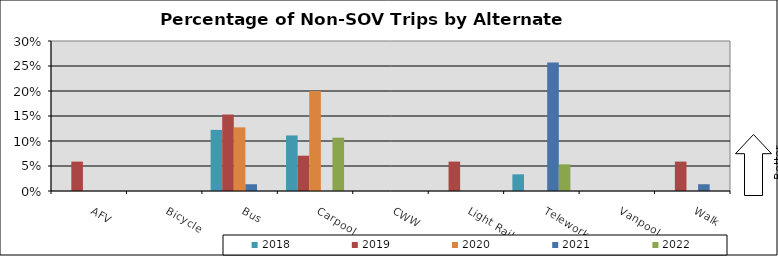
| Category | 2018 | 2019 | 2020 | 2021 | 2022 |
|---|---|---|---|---|---|
| AFV | 0 | 0.059 | 0 | 0 | 0 |
| Bicycle | 0 | 0 | 0 | 0 | 0 |
| Bus | 0.122 | 0.153 | 0.127 | 0.014 | 0 |
| Carpool | 0.111 | 0.071 | 0.2 | 0 | 0.107 |
| CWW | 0 | 0 | 0 | 0 | 0 |
| Light Rail | 0 | 0.059 | 0 | 0 | 0 |
| Telework | 0.033 | 0 | 0 | 0.257 | 0.053 |
| Vanpool | 0 | 0 | 0 | 0 | 0 |
| Walk | 0 | 0.059 | 0 | 0.014 | 0 |